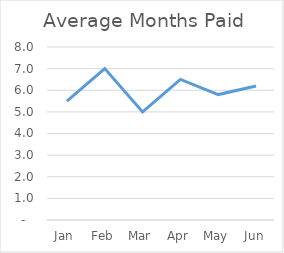
| Category | Average Months Paid Upfront |
|---|---|
| Jan | 5.5 |
| Feb | 7 |
| Mar | 5 |
| Apr | 6.5 |
| May | 5.8 |
| Jun | 6.2 |